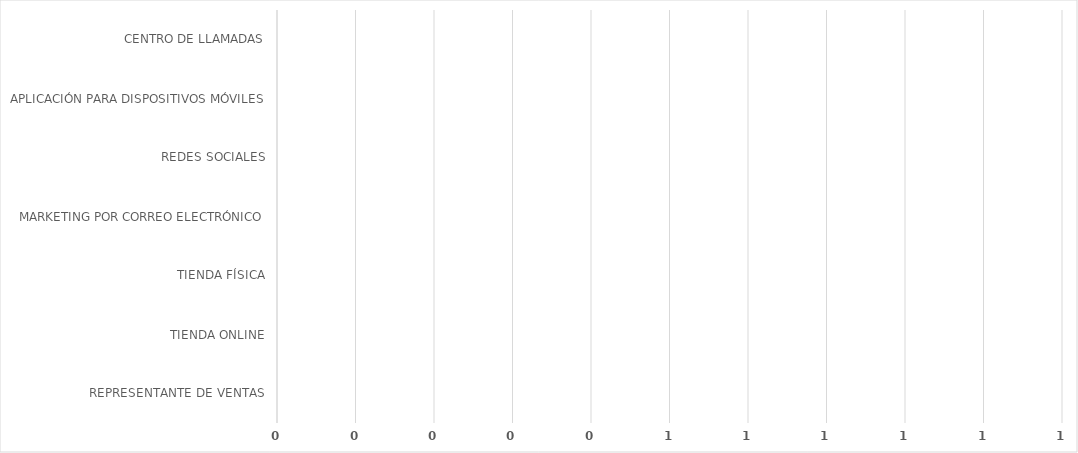
| Category | Series 0 |
|---|---|
| REPRESENTANTE DE VENTAS | 0 |
| TIENDA ONLINE | 0 |
| TIENDA FÍSICA | 0 |
| MARKETING POR CORREO ELECTRÓNICO | 0 |
| REDES SOCIALES | 0 |
| APLICACIÓN PARA DISPOSITIVOS MÓVILES | 0 |
| CENTRO DE LLAMADAS | 0 |